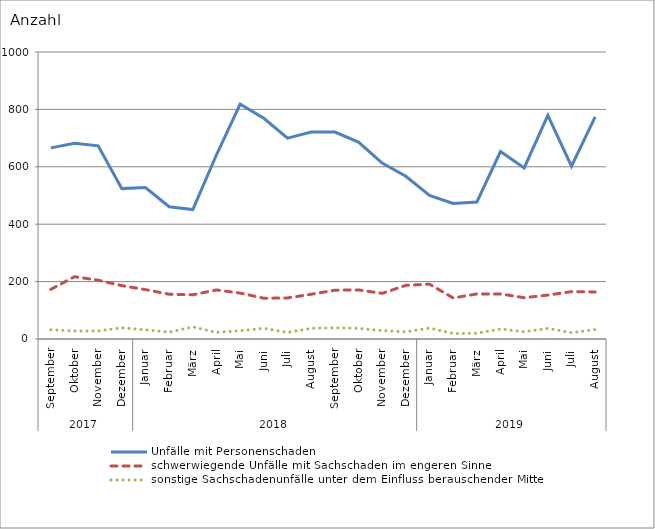
| Category | Unfälle mit Personenschaden | schwerwiegende Unfälle mit Sachschaden im engeren Sinne | sonstige Sachschadenunfälle unter dem Einfluss berauschender Mittel |
|---|---|---|---|
| 0 | 666 | 173 | 32 |
| 1 | 682 | 217 | 28 |
| 2 | 673 | 205 | 28 |
| 3 | 524 | 186 | 39 |
| 4 | 528 | 172 | 32 |
| 5 | 461 | 156 | 24 |
| 6 | 451 | 154 | 42 |
| 7 | 642 | 171 | 23 |
| 8 | 818 | 160 | 29 |
| 9 | 769 | 142 | 37 |
| 10 | 700 | 143 | 23 |
| 11 | 721 | 156 | 37 |
| 12 | 721 | 170 | 39 |
| 13 | 686 | 171 | 37 |
| 14 | 613 | 159 | 29 |
| 15 | 567 | 187 | 25 |
| 16 | 500 | 191 | 38 |
| 17 | 472 | 143 | 19 |
| 18 | 477 | 157 | 20 |
| 19 | 653 | 157 | 35 |
| 20 | 596 | 144 | 25 |
| 21 | 779 | 153 | 37 |
| 22 | 602 | 165 | 22 |
| 23 | 774 | 164 | 33 |